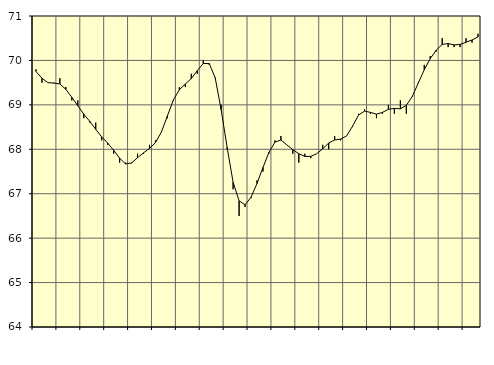
| Category | Piggar | Series 1 |
|---|---|---|
| nan | 69.8 | 69.75 |
| 1.0 | 69.5 | 69.6 |
| 1.0 | 69.5 | 69.5 |
| 1.0 | 69.5 | 69.49 |
| nan | 69.6 | 69.47 |
| 2.0 | 69.4 | 69.35 |
| 2.0 | 69.1 | 69.17 |
| 2.0 | 69.1 | 68.98 |
| nan | 68.7 | 68.79 |
| 3.0 | 68.6 | 68.63 |
| 3.0 | 68.6 | 68.45 |
| 3.0 | 68.2 | 68.28 |
| nan | 68.1 | 68.14 |
| 4.0 | 67.9 | 67.98 |
| 4.0 | 67.7 | 67.8 |
| 4.0 | 67.7 | 67.67 |
| nan | 67.7 | 67.69 |
| 5.0 | 67.9 | 67.81 |
| 5.0 | 67.9 | 67.92 |
| 5.0 | 68.1 | 68.02 |
| nan | 68.2 | 68.15 |
| 6.0 | 68.4 | 68.39 |
| 6.0 | 68.7 | 68.75 |
| 6.0 | 69.1 | 69.11 |
| nan | 69.4 | 69.34 |
| 7.0 | 69.4 | 69.47 |
| 7.0 | 69.7 | 69.59 |
| 7.0 | 69.7 | 69.77 |
| nan | 70 | 69.93 |
| 8.0 | 69.9 | 69.93 |
| 8.0 | 69.6 | 69.61 |
| 8.0 | 69 | 68.89 |
| nan | 68 | 68.04 |
| 9.0 | 67.1 | 67.26 |
| 9.0 | 66.5 | 66.84 |
| 9.0 | 66.7 | 66.75 |
| nan | 66.9 | 66.92 |
| 10.0 | 67.3 | 67.23 |
| 10.0 | 67.5 | 67.59 |
| 10.0 | 67.9 | 67.93 |
| nan | 68.2 | 68.16 |
| 11.0 | 68.3 | 68.21 |
| 11.0 | 68.1 | 68.1 |
| 11.0 | 67.9 | 67.99 |
| nan | 67.7 | 67.9 |
| 12.0 | 67.9 | 67.84 |
| 12.0 | 67.8 | 67.84 |
| 12.0 | 67.9 | 67.9 |
| nan | 68.1 | 68.01 |
| 13.0 | 68 | 68.14 |
| 13.0 | 68.3 | 68.21 |
| 13.0 | 68.2 | 68.23 |
| nan | 68.3 | 68.3 |
| 14.0 | 68.5 | 68.52 |
| 14.0 | 68.8 | 68.77 |
| 14.0 | 68.9 | 68.86 |
| nan | 68.8 | 68.83 |
| 15.0 | 68.7 | 68.79 |
| 15.0 | 68.8 | 68.83 |
| 15.0 | 69 | 68.9 |
| nan | 68.8 | 68.92 |
| 16.0 | 69.1 | 68.91 |
| 16.0 | 68.8 | 68.99 |
| 16.0 | 69.2 | 69.19 |
| nan | 69.5 | 69.49 |
| 17.0 | 69.9 | 69.79 |
| 17.0 | 70.1 | 70.04 |
| 17.0 | 70.2 | 70.23 |
| nan | 70.5 | 70.36 |
| 18.0 | 70.3 | 70.38 |
| 18.0 | 70.3 | 70.35 |
| 18.0 | 70.3 | 70.36 |
| nan | 70.5 | 70.41 |
| 19.0 | 70.4 | 70.46 |
| 19.0 | 70.6 | 70.53 |